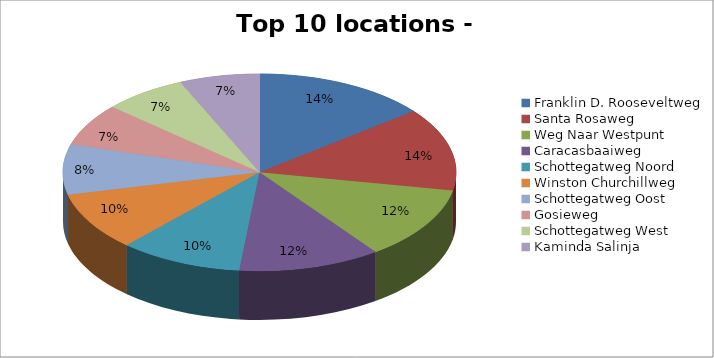
| Category | Series 0 |
|---|---|
| Franklin D. Rooseveltweg | 517 |
| Santa Rosaweg | 493 |
| Weg Naar Westpunt | 433 |
| Caracasbaaiweg | 422 |
| Schottegatweg Noord | 366 |
| Winston Churchillweg | 345 |
| Schottegatweg Oost | 299 |
| Gosieweg | 250 |
| Schottegatweg West | 248 |
| Kaminda Salinja | 238 |